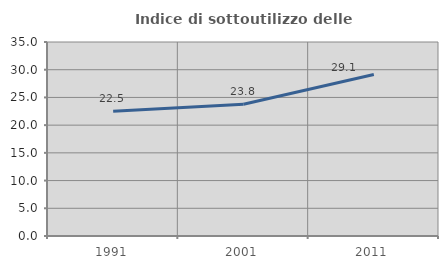
| Category | Indice di sottoutilizzo delle abitazioni  |
|---|---|
| 1991.0 | 22.495 |
| 2001.0 | 23.775 |
| 2011.0 | 29.144 |